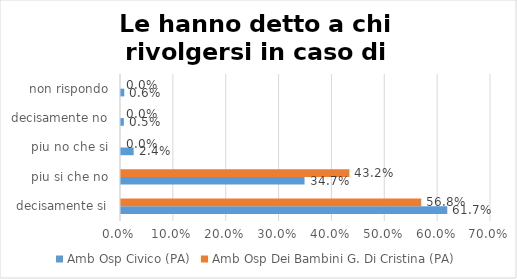
| Category | Amb Osp Civico (PA) | Amb Osp Dei Bambini G. Di Cristina (PA) |
|---|---|---|
| decisamente si | 0.617 | 0.568 |
| piu si che no | 0.347 | 0.432 |
| piu no che si | 0.024 | 0 |
| decisamente no | 0.005 | 0 |
| non rispondo | 0.006 | 0 |